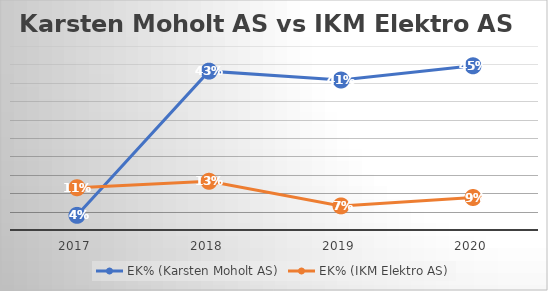
| Category | EK% (Karsten Moholt AS) | EK% (IKM Elektro AS) |
|---|---|---|
| 2017.0 | 0.04 | 0.115 |
| 2018.0 | 0.432 | 0.132 |
| 2019.0 | 0.407 | 0.065 |
| 2020.0 | 0.446 | 0.088 |